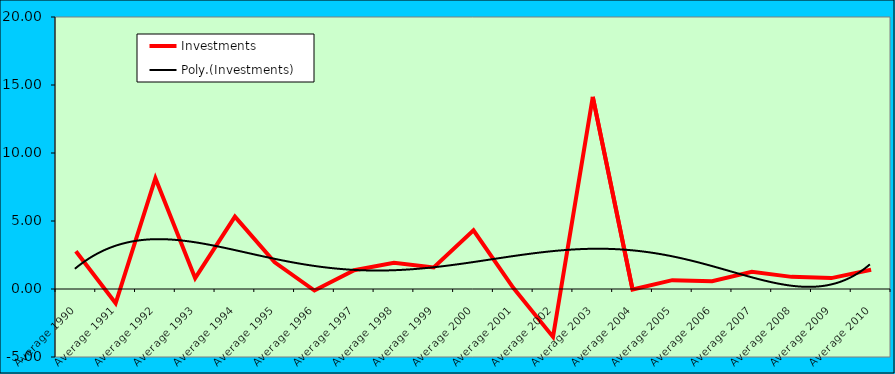
| Category | Investments |
|---|---|
| Average 1990 | 2.78 |
| Average 1991 | -1.046 |
| Average 1992 | 8.147 |
| Average 1993 | 0.8 |
| Average 1994 | 5.317 |
| Average 1995 | 1.962 |
| Average 1996 | -0.112 |
| Average 1997 | 1.382 |
| Average 1998 | 1.927 |
| Average 1999 | 1.584 |
| Average 2000 | 4.311 |
| Average 2001 | 0.087 |
| Average 2002 | -3.521 |
| Average 2003 | 14.131 |
| Average 2004 | -0.035 |
| Average 2005 | 0.651 |
| Average 2006 | 0.577 |
| Average 2007 | 1.263 |
| Average 2008 | 0.892 |
| Average 2009 | 0.802 |
| Average 2010 | 1.417 |